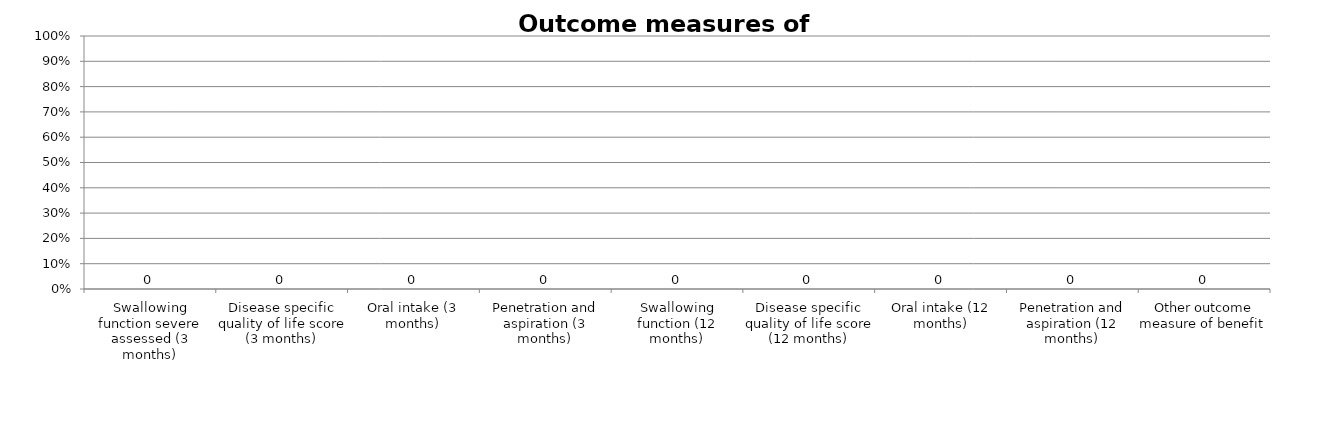
| Category | Series 0 |
|---|---|
| Swallowing function severe assessed (3 months) | 0 |
| Disease specific quality of life score (3 months) | 0 |
| Oral intake (3 months) | 0 |
| Penetration and aspiration (3 months) | 0 |
| Swallowing function (12 months) | 0 |
| Disease specific quality of life score (12 months) | 0 |
| Oral intake (12 months) | 0 |
| Penetration and aspiration (12 months) | 0 |
| Other outcome measure of benefit  | 0 |